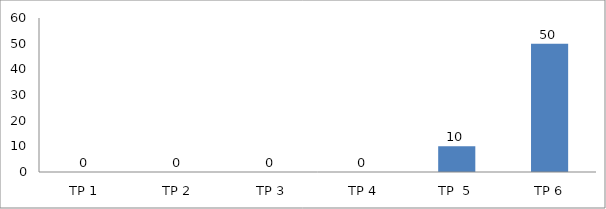
| Category | BIL. MURID |
|---|---|
| TP 1 | 0 |
| TP 2 | 0 |
|  TP 3 | 0 |
| TP 4 | 0 |
| TP  5 | 10 |
| TP 6 | 50 |